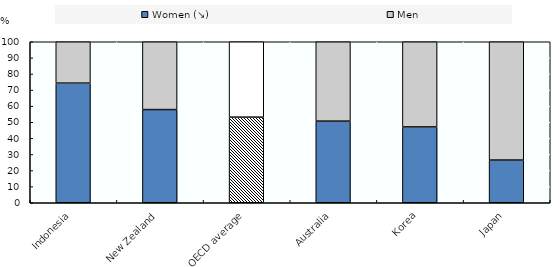
| Category | Women (↘) | Men |
|---|---|---|
| Indonesia | 74.297 | 25.703 |
| New Zealand | 57.875 | 42.125 |
| OECD average | 53.19 | 46.81 |
| Australia | 50.702 | 49.298 |
| Korea | 47.09 | 52.91 |
| Japan | 26.516 | 73.484 |